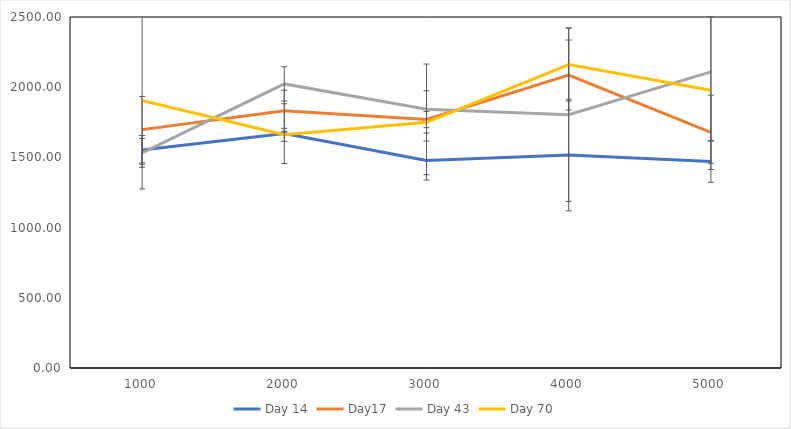
| Category | Day 14 | Day17 | Day 43 | Day 70 |
|---|---|---|---|---|
| 1000.0 | 1553.297 | 1697.823 | 1531.913 | 1905.114 |
| 2000.0 | 1669.345 | 1832.064 | 2023.29 | 1660.878 |
| 3000.0 | 1477.729 | 1770.833 | 1843.13 | 1750.23 |
| 4000.0 | 1516.558 | 2086.85 | 1804.602 | 2161.527 |
| 5000.0 | 1471.617 | 1678.338 | 2108.707 | 1978.707 |